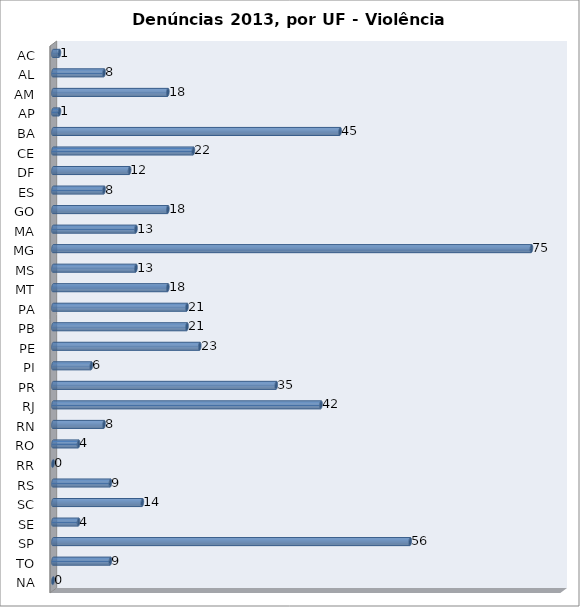
| Category | Series 0 |
|---|---|
| AC | 1 |
| AL | 8 |
| AM | 18 |
| AP | 1 |
| BA | 45 |
| CE | 22 |
| DF | 12 |
| ES | 8 |
| GO | 18 |
| MA | 13 |
| MG | 75 |
| MS | 13 |
| MT | 18 |
| PA | 21 |
| PB | 21 |
| PE | 23 |
| PI | 6 |
| PR | 35 |
| RJ | 42 |
| RN | 8 |
| RO | 4 |
| RR | 0 |
| RS | 9 |
| SC | 14 |
| SE | 4 |
| SP | 56 |
| TO | 9 |
| NA | 0 |